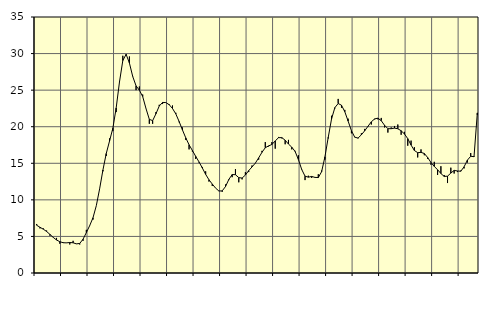
| Category | Piggar | Series 1 |
|---|---|---|
| nan | 6.7 | 6.53 |
| 87.0 | 6.1 | 6.25 |
| 87.0 | 6.1 | 5.99 |
| 87.0 | 5.8 | 5.68 |
| nan | 5.1 | 5.28 |
| 88.0 | 4.9 | 4.87 |
| 88.0 | 4.8 | 4.51 |
| 88.0 | 4 | 4.28 |
| nan | 4.2 | 4.14 |
| 89.0 | 4.1 | 4.12 |
| 89.0 | 3.9 | 4.17 |
| 89.0 | 4.4 | 4.13 |
| nan | 4 | 3.98 |
| 90.0 | 3.9 | 4.04 |
| 90.0 | 4.4 | 4.62 |
| 90.0 | 5.9 | 5.52 |
| nan | 6.5 | 6.47 |
| 91.0 | 7.3 | 7.55 |
| 91.0 | 9.2 | 9.2 |
| 91.0 | 11.5 | 11.5 |
| nan | 13.9 | 14.08 |
| 92.0 | 16 | 16.33 |
| 92.0 | 18.4 | 18.05 |
| 92.0 | 19.4 | 19.8 |
| nan | 22 | 22.57 |
| 93.0 | 26.2 | 26.13 |
| 93.0 | 29.7 | 29.04 |
| 93.0 | 29.8 | 29.9 |
| nan | 29.6 | 28.7 |
| 94.0 | 26.9 | 26.86 |
| 94.0 | 25 | 25.59 |
| 94.0 | 25.5 | 24.99 |
| nan | 24.4 | 24.13 |
| 95.0 | 22.5 | 22.48 |
| 95.0 | 20.4 | 21.01 |
| 95.0 | 20.4 | 20.83 |
| nan | 22 | 21.77 |
| 96.0 | 23 | 22.83 |
| 96.0 | 23.1 | 23.32 |
| 96.0 | 23.3 | 23.3 |
| nan | 23.1 | 23.01 |
| 97.0 | 22.9 | 22.49 |
| 97.0 | 21.9 | 21.75 |
| 97.0 | 20.6 | 20.71 |
| nan | 19.9 | 19.56 |
| 98.0 | 18.2 | 18.48 |
| 98.0 | 16.9 | 17.53 |
| 98.0 | 16.6 | 16.75 |
| nan | 15.6 | 15.95 |
| 99.0 | 15.1 | 15.19 |
| 99.0 | 14.5 | 14.36 |
| 99.0 | 13.9 | 13.49 |
| nan | 12.5 | 12.75 |
| 0.0 | 11.9 | 12.16 |
| 0.0 | 11.6 | 11.61 |
| 0.0 | 11.2 | 11.21 |
| nan | 11.1 | 11.23 |
| 1.0 | 12.1 | 11.82 |
| 1.0 | 12.7 | 12.79 |
| 1.0 | 13.1 | 13.46 |
| nan | 14.2 | 13.44 |
| 2.0 | 12.4 | 13.04 |
| 2.0 | 12.8 | 12.98 |
| 2.0 | 13.8 | 13.39 |
| nan | 13.8 | 14 |
| 3.0 | 14.7 | 14.5 |
| 3.0 | 15 | 15.02 |
| 3.0 | 15.5 | 15.74 |
| nan | 16.7 | 16.5 |
| 4.0 | 17.9 | 17.13 |
| 4.0 | 17.3 | 17.38 |
| 4.0 | 17.9 | 17.57 |
| nan | 17 | 18.06 |
| 5.0 | 18.6 | 18.5 |
| 5.0 | 18.4 | 18.51 |
| 5.0 | 17.6 | 18.15 |
| nan | 18.2 | 17.63 |
| 6.0 | 16.9 | 17.2 |
| 6.0 | 16.7 | 16.62 |
| 6.0 | 16.1 | 15.51 |
| nan | 14.2 | 14.15 |
| 7.0 | 12.7 | 13.24 |
| 7.0 | 13.3 | 13.1 |
| 7.0 | 13 | 13.2 |
| nan | 13.1 | 13.07 |
| 8.0 | 13.5 | 13.05 |
| 8.0 | 14 | 13.85 |
| 8.0 | 15.5 | 15.88 |
| nan | 18.4 | 18.55 |
| 9.0 | 21.5 | 21.07 |
| 9.0 | 22.5 | 22.61 |
| 9.0 | 23.8 | 23.17 |
| nan | 22.6 | 22.94 |
| 10.0 | 22.3 | 22.05 |
| 10.0 | 21.1 | 20.77 |
| 10.0 | 19.1 | 19.46 |
| nan | 18.6 | 18.57 |
| 11.0 | 18.4 | 18.45 |
| 11.0 | 19.1 | 18.89 |
| 11.0 | 19.7 | 19.44 |
| nan | 20 | 20.06 |
| 12.0 | 20.3 | 20.67 |
| 12.0 | 21 | 21.07 |
| 12.0 | 21 | 21.17 |
| nan | 21.2 | 20.82 |
| 13.0 | 19.9 | 20.19 |
| 13.0 | 19.2 | 19.73 |
| 13.0 | 19.9 | 19.73 |
| nan | 20.1 | 19.81 |
| 14.0 | 20.3 | 19.72 |
| 14.0 | 18.9 | 19.45 |
| 14.0 | 19.3 | 19.01 |
| nan | 17.4 | 18.37 |
| 15.0 | 18.1 | 17.49 |
| 15.0 | 17.2 | 16.75 |
| 15.0 | 15.8 | 16.45 |
| nan | 16.9 | 16.49 |
| 16.0 | 16.1 | 16.34 |
| 16.0 | 15.6 | 15.79 |
| 16.0 | 14.8 | 15.11 |
| nan | 15.2 | 14.57 |
| 17.0 | 13.4 | 14.12 |
| 17.0 | 14.6 | 13.6 |
| 17.0 | 13.4 | 13.2 |
| nan | 12.3 | 13.24 |
| 18.0 | 14.4 | 13.66 |
| 18.0 | 13.6 | 14.03 |
| 18.0 | 13.8 | 13.95 |
| nan | 14 | 13.91 |
| 19.0 | 14.3 | 14.52 |
| 19.0 | 15.1 | 15.43 |
| 19.0 | 16.4 | 15.96 |
| nan | 16 | 15.9 |
| 20.0 | 21.6 | 21.89 |